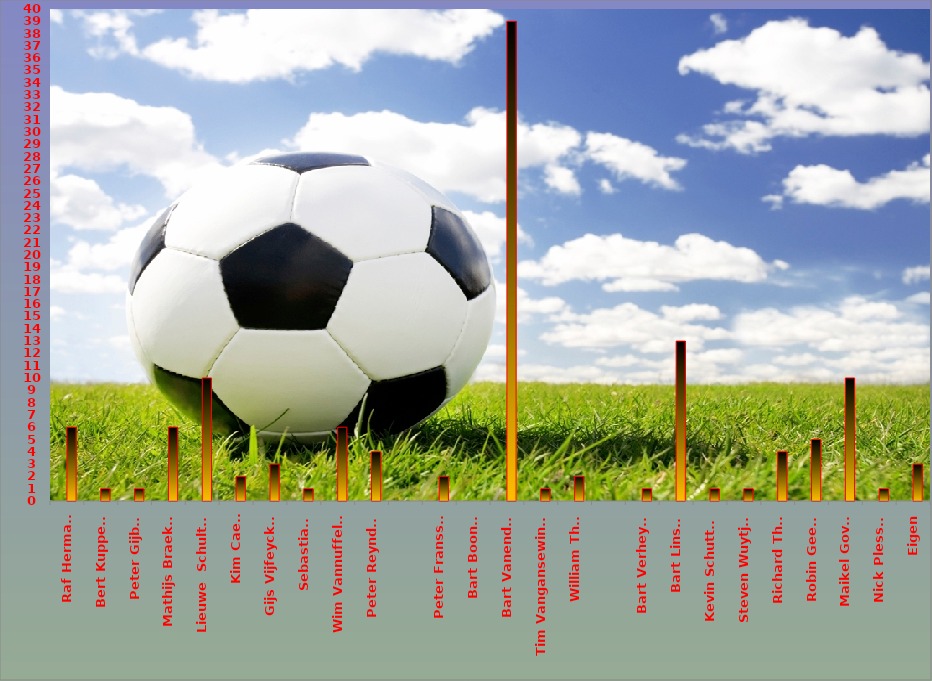
| Category | Series 0 | Series 1 |
|---|---|---|
| Raf Hermans |  | 6 |
| Bert Kuppens |  | 1 |
| Peter Gijbels |  | 1 |
| Mathijs Braeken |  | 6 |
| Lieuwe  Schultink |  | 10 |
| Kim Caels |  | 2 |
| Gijs Vijfeycken |  | 3 |
| Sebastiaan |  | 1 |
| Wim Vannuffelen |  | 6 |
| Peter Reynders |  | 4 |
|  |  | 0 |
| Peter Franssen |  | 2 |
| Bart Boonen |  | 0 |
| Bart Vanendert |  | 39 |
| Tim Vangansewinkel |  | 1 |
| William Thijs |  | 2 |
|  |  | 0 |
| Bart Verheyen |  | 1 |
| Bart Linsen |  | 13 |
| Kevin Schutters |  | 1 |
| Steven Wuytjes |  | 1 |
| Richard Thijs |  | 4 |
| Robin Geerts |  | 5 |
| Maikel Goven |  | 10 |
| Nick Plessers |  | 1 |
| Eigen |  | 3 |